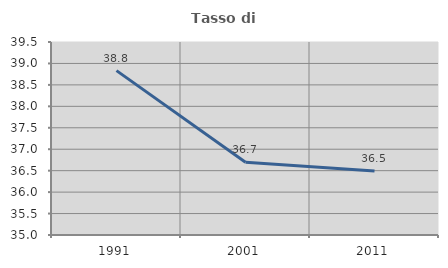
| Category | Tasso di occupazione   |
|---|---|
| 1991.0 | 38.832 |
| 2001.0 | 36.697 |
| 2011.0 | 36.495 |